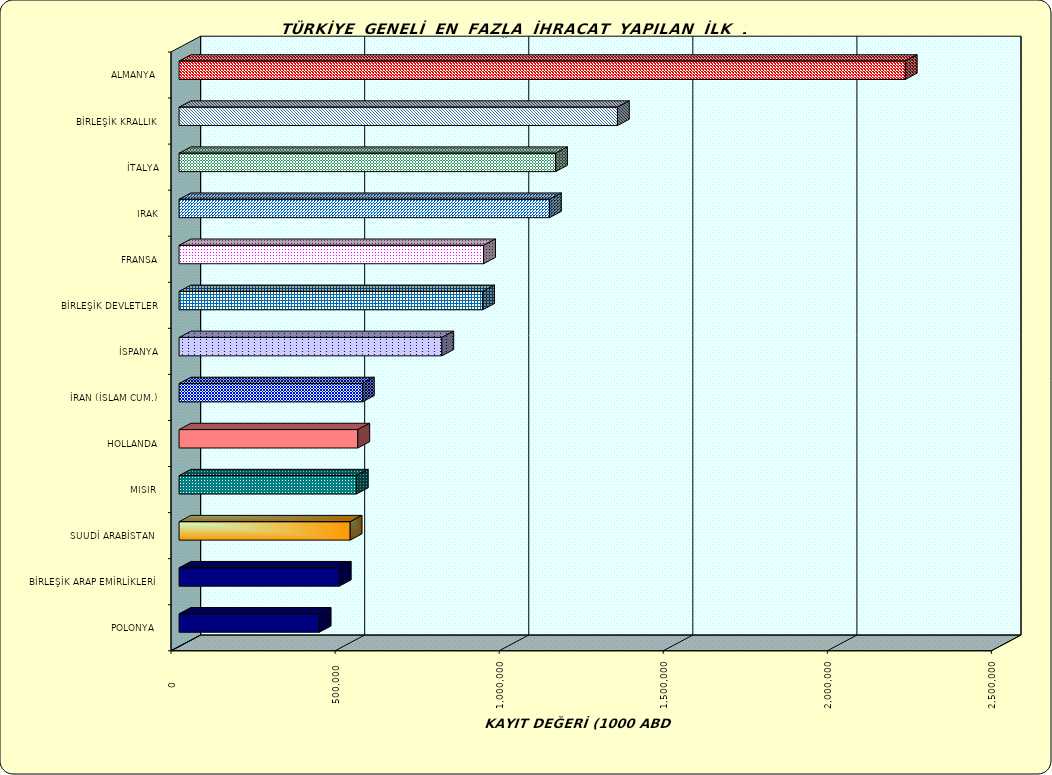
| Category | Series 0 |
|---|---|
| ALMANYA  | 2213034.699 |
| BİRLEŞİK KRALLIK | 1335884.246 |
| İTALYA | 1147358.13 |
| IRAK | 1128807.875 |
| FRANSA | 927971.344 |
| BİRLEŞİK DEVLETLER | 925198.334 |
| İSPANYA | 800713.462 |
| İRAN (İSLAM CUM.) | 558680.589 |
| HOLLANDA | 544743.29 |
| MISIR  | 540270.027 |
| SUUDİ ARABİSTAN  | 521433.978 |
| BİRLEŞİK ARAP EMİRLİKLERİ | 488261.81 |
| POLONYA  | 427054.957 |